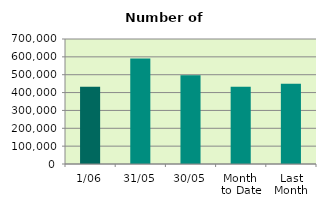
| Category | Series 0 |
|---|---|
| 1/06 | 432164 |
| 31/05 | 590628 |
| 30/05 | 496984 |
| Month 
to Date | 432164 |
| Last
Month | 449234.545 |